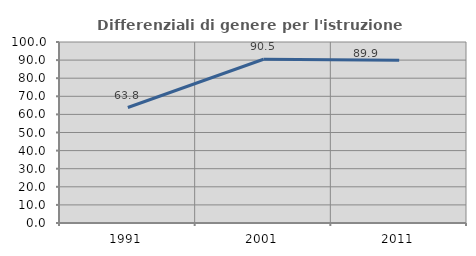
| Category | Differenziali di genere per l'istruzione superiore |
|---|---|
| 1991.0 | 63.802 |
| 2001.0 | 90.489 |
| 2011.0 | 89.863 |